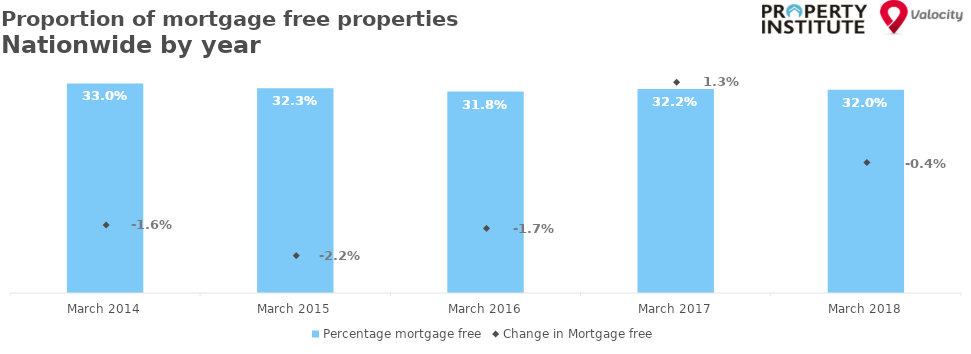
| Category | Percentage mortgage free |
|---|---|
| 2014-03-01 | 0.33 |
| 2015-03-01 | 0.323 |
| 2016-03-01 | 0.318 |
| 2017-03-01 | 0.322 |
| 2018-03-01 | 0.32 |